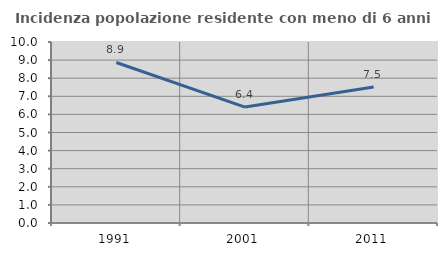
| Category | Incidenza popolazione residente con meno di 6 anni |
|---|---|
| 1991.0 | 8.869 |
| 2001.0 | 6.404 |
| 2011.0 | 7.513 |